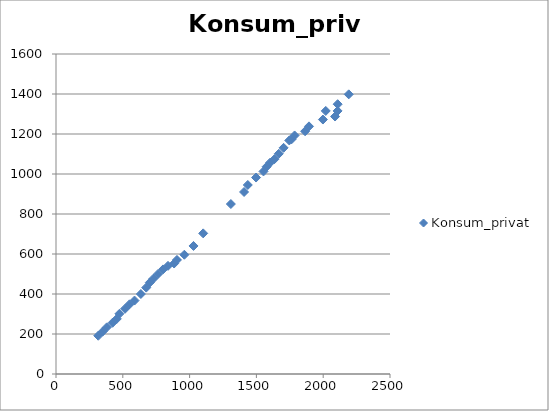
| Category | Konsum_privat |
|---|---|
| 316.31 | 191.29 |
| 349.55 | 212.23 |
| 379.76 | 233.18 |
| 423.15 | 256.08 |
| 455.12 | 275.59 |
| 475.03 | 301.1 |
| 516.64 | 326.15 |
| 550.32 | 348.44 |
| 587.79 | 367.2 |
| 635.15 | 399.93 |
| 675.23 | 431.89 |
| 702.13 | 457.08 |
| 728.11 | 476.2 |
| 762.87 | 499.4 |
| 801.04 | 522.96 |
| 838.43 | 540.79 |
| 884.14 | 552.4 |
| 905.29 | 570.28 |
| 960.75 | 596.27 |
| 1029.29 | 640.16 |
| 1101.62 | 703.2 |
| 1308.84 | 849.85 |
| 1407.65 | 910.09 |
| 1435.56 | 945.11 |
| 1497.36 | 982.27 |
| 1552.92 | 1012.77 |
| 1576.65 | 1036.38 |
| 1602.7 | 1056.72 |
| 1635.2 | 1074.18 |
| 1667.62 | 1101.02 |
| 1703.63 | 1130.85 |
| 1746.02 | 1167.71 |
| 1762.92 | 1173.24 |
| 1785.85 | 1192.67 |
| 1864.49 | 1213.66 |
| 1893.8 | 1238.17 |
| 1998.02 | 1272.27 |
| 2088.69 | 1287.38 |
| 2107.68 | 1315.39 |
| 2019.16 | 1315.32 |
| 2108.21 | 1349.06 |
| 2191.13 | 1398.34 |